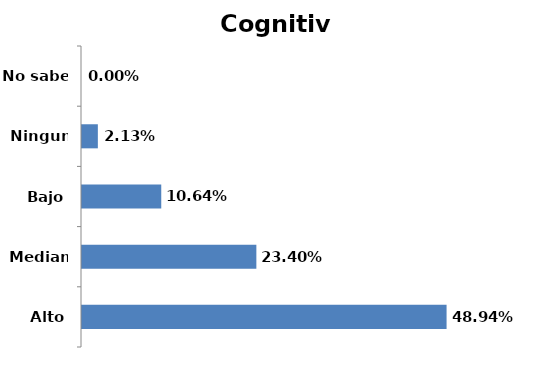
| Category | Series 0 |
|---|---|
| Alto | 0.489 |
| Mediano | 0.234 |
| Bajo | 0.106 |
| Ninguno | 0.021 |
| No sabe | 0 |